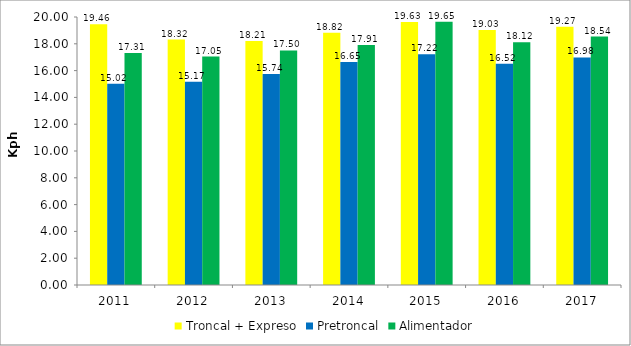
| Category | Troncal + Expreso | Pretroncal | Alimentador |
|---|---|---|---|
| 2011.0 | 19.46 | 15.022 | 17.311 |
| 2012.0 | 18.316 | 15.165 | 17.046 |
| 2013.0 | 18.214 | 15.74 | 17.501 |
| 2014.0 | 18.821 | 16.648 | 17.905 |
| 2015.0 | 19.63 | 17.216 | 19.654 |
| 2016.0 | 19.028 | 16.518 | 18.12 |
| 2017.0 | 19.27 | 16.98 | 18.54 |